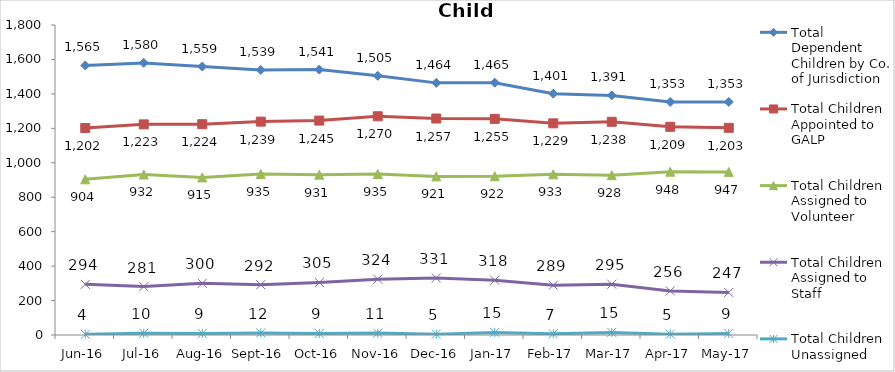
| Category | Total Dependent Children by Co. of Jurisdiction | Total Children Appointed to GALP | Total Children Assigned to Volunteer | Total Children Assigned to Staff | Total Children Unassigned |
|---|---|---|---|---|---|
| Jun-16 | 1565 | 1202 | 904 | 294 | 4 |
| Jul-16 | 1580 | 1223 | 932 | 281 | 10 |
| Aug-16 | 1559 | 1224 | 915 | 300 | 9 |
| Sep-16 | 1539 | 1239 | 935 | 292 | 12 |
| Oct-16 | 1541 | 1245 | 931 | 305 | 9 |
| Nov-16 | 1505 | 1270 | 935 | 324 | 11 |
| Dec-16 | 1464 | 1257 | 921 | 331 | 5 |
| Jan-17 | 1465 | 1255 | 922 | 318 | 15 |
| Feb-17 | 1401 | 1229 | 933 | 289 | 7 |
| Mar-17 | 1391 | 1238 | 928 | 295 | 15 |
| Apr-17 | 1353 | 1209 | 948 | 256 | 5 |
| May-17 | 1353 | 1203 | 947 | 247 | 9 |